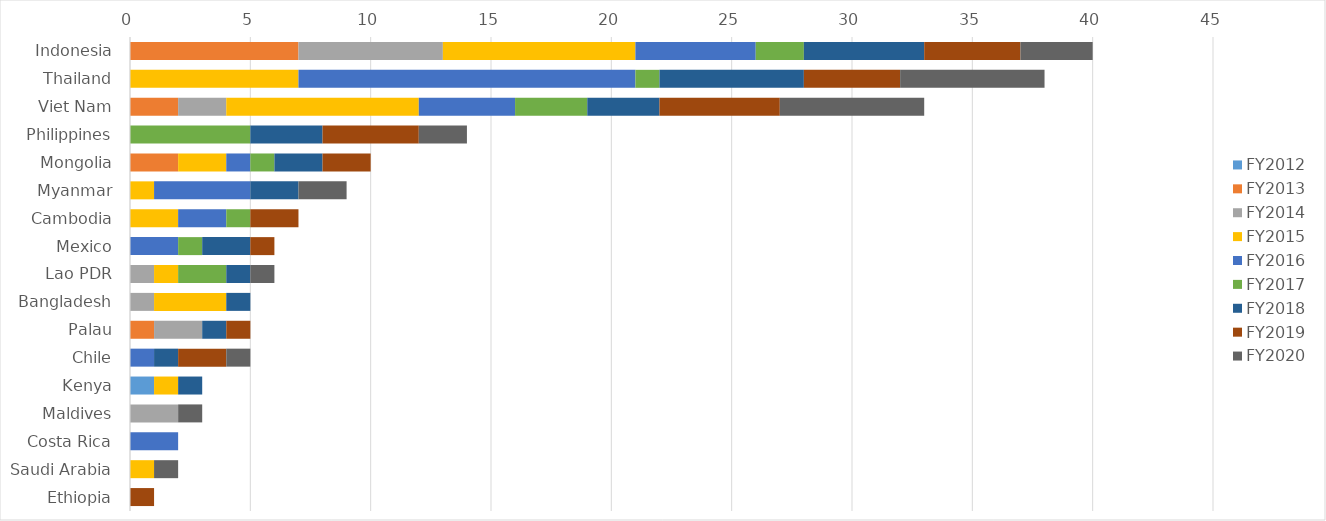
| Category | FY2012 | FY2013 | FY2014 | FY2015 | FY2016 | FY2017 | FY2018 | FY2019 | FY2020 |
|---|---|---|---|---|---|---|---|---|---|
| Indonesia | 0 | 7 | 6 | 8 | 5 | 2 | 5 | 4 | 3 |
| Thailand | 0 | 0 | 0 | 7 | 14 | 1 | 6 | 4 | 6 |
| Viet Nam | 0 | 2 | 2 | 8 | 4 | 3 | 3 | 5 | 6 |
| Philippines | 0 | 0 | 0 | 0 | 0 | 5 | 3 | 4 | 2 |
| Mongolia | 0 | 2 | 0 | 2 | 1 | 1 | 2 | 2 | 0 |
| Myanmar | 0 | 0 | 0 | 1 | 4 | 0 | 2 | 0 | 2 |
| Cambodia | 0 | 0 | 0 | 2 | 2 | 1 | 0 | 2 | 0 |
| Mexico | 0 | 0 | 0 | 0 | 2 | 1 | 2 | 1 | 0 |
| Lao PDR | 0 | 0 | 1 | 1 | 0 | 2 | 1 | 0 | 1 |
| Bangladesh | 0 | 0 | 1 | 3 | 0 | 0 | 1 | 0 | 0 |
| Palau | 0 | 1 | 2 | 0 | 0 | 0 | 1 | 1 | 0 |
| Chile | 0 | 0 | 0 | 0 | 1 | 0 | 1 | 2 | 1 |
| Kenya | 1 | 0 | 0 | 1 | 0 | 0 | 1 | 0 | 0 |
| Maldives | 0 | 0 | 2 | 0 | 0 | 0 | 0 | 0 | 1 |
| Costa Rica | 0 | 0 | 0 | 0 | 2 | 0 | 0 | 0 | 0 |
| Saudi Arabia | 0 | 0 | 0 | 1 | 0 | 0 | 0 | 0 | 1 |
| Ethiopia | 0 | 0 | 0 | 0 | 0 | 0 | 0 | 1 | 0 |